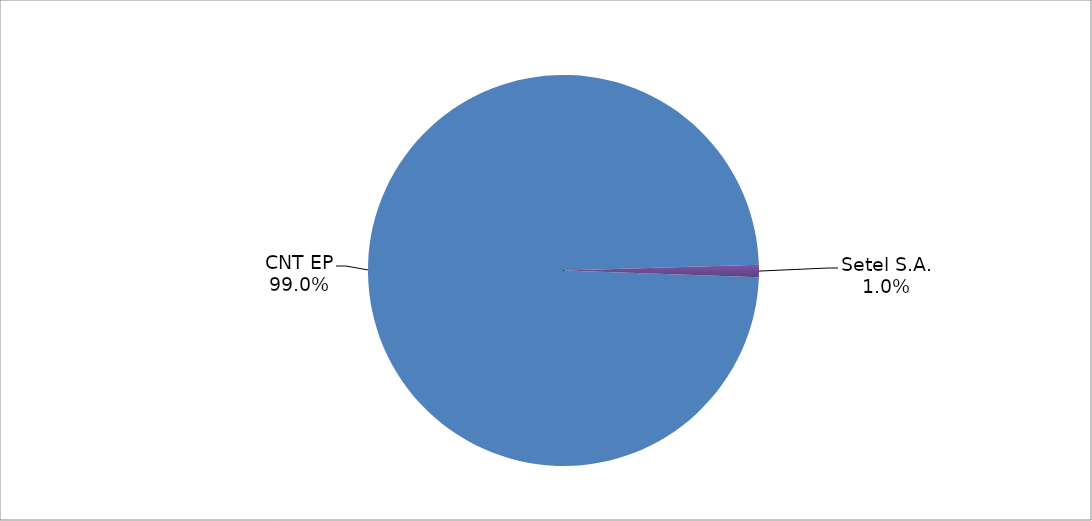
| Category | Series 0 |
|---|---|
| CNT EP | 292 |
| Setel S.A. | 3 |